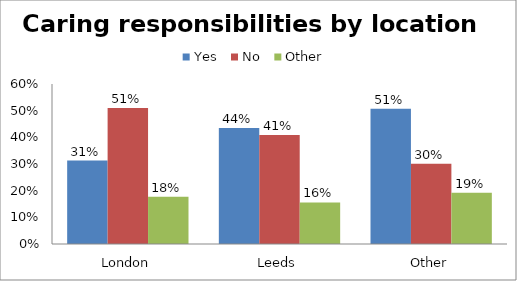
| Category | Yes | No | Other |
|---|---|---|---|
| London | 0.313 | 0.51 | 0.177 |
| Leeds | 0.435 | 0.409 | 0.156 |
| Other | 0.507 | 0.301 | 0.192 |